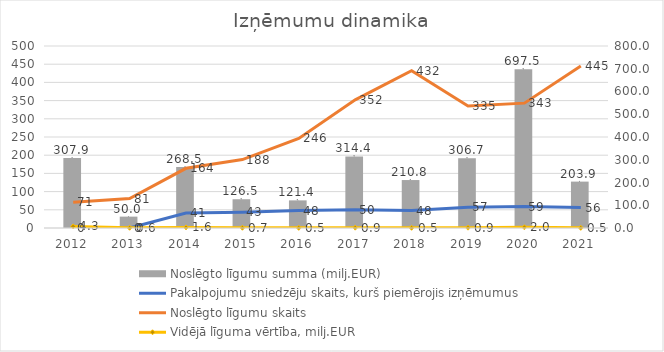
| Category | Noslēgto līgumu summa (milj.EUR) |
|---|---|
| 2012.0 | 307.912 |
| 2013.0 | 50.012 |
| 2014.0 | 268.503 |
| 2015.0 | 126.516 |
| 2016.0 | 121.4 |
| 2017.0 | 314.424 |
| 2018.0 | 210.8 |
| 2019.0 | 306.7 |
| 2020.0 | 697.5 |
| 2021.0 | 203.9 |